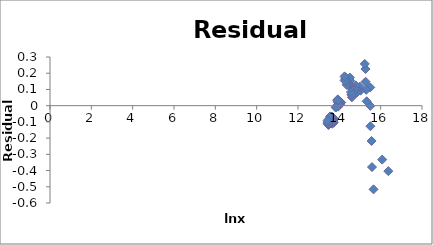
| Category | Series 0 |
|---|---|
| 16.3706277375923 | -0.404 |
| 16.0741044732111 | -0.332 |
| 15.65606114374226 | -0.516 |
| 15.57997950545637 | -0.378 |
| 15.5609019523948 | -0.218 |
| 15.50464133226762 | -0.127 |
| 15.49750817317282 | -0.001 |
| 15.49412559157698 | 0.113 |
| 15.32465465287539 | 0.027 |
| 15.30280569487226 | 0.098 |
| 15.26990716074476 | 0.148 |
| 15.26818494673234 | 0.226 |
| 15.23036103433706 | 0.257 |
| 15.02292134564693 | 0.092 |
| 14.98795492358767 | 0.118 |
| 14.91448011613737 | 0.095 |
| 14.8510800951623 | 0.081 |
| 14.82118887474188 | 0.101 |
| 14.79650867171822 | 0.125 |
| 14.73444818372206 | 0.104 |
| 14.6704329915632 | 0.078 |
| 14.60735399726905 | 0.051 |
| 14.58336485258515 | 0.067 |
| 14.56211888142926 | 0.084 |
| 14.55185658608997 | 0.112 |
| 14.53557908515294 | 0.131 |
| 14.52425792045248 | 0.155 |
| 14.50968071510521 | 0.173 |
| 14.43917153108138 | 0.128 |
| 14.41390630259346 | 0.132 |
| 14.38825126466112 | 0.135 |
| 14.35519124125735 | 0.128 |
| 14.34719648478431 | 0.149 |
| 14.32129871497298 | 0.149 |
| 14.3178615734627 | 0.173 |
| 14.28589598931431 | 0.165 |
| 14.25423828033774 | 0.156 |
| 14.25331893759333 | 0.181 |
| 14.08799878634388 | 0.02 |
| 14.06683876392804 | 0.02 |
| 14.03440188135813 | 0.008 |
| 14.01896229184266 | 0.014 |
| 14.0029373939482 | 0.019 |
| 13.98989402465666 | 0.027 |
| 13.94128733613509 | -0.006 |
| 13.93267918268669 | 0.006 |
| 13.9267012450954 | 0.02 |
| 13.92498539816926 | 0.039 |
| 13.90055458432145 | 0.031 |
| 13.84903237088165 | -0.007 |
| 13.82745691523263 | -0.012 |
| 13.7278578844789 | -0.105 |
| 13.72026867582761 | -0.095 |
| 13.71572779103714 | -0.082 |
| 13.7046125162483 | -0.076 |
| 13.6575916204972 | -0.111 |
| 13.64839401680529 | -0.104 |
| 13.64817179642085 | -0.088 |
| 13.63868387665228 | -0.081 |
| 13.63703439814522 | -0.067 |
| 13.60257720472492 | -0.089 |
| 13.59293934283446 | -0.084 |
| 13.58953800880652 | -0.072 |
| 13.56878103151053 | -0.08 |
| 13.56286352787815 | -0.072 |
| 13.55419384462346 | -0.066 |
| 13.50717533662535 | -0.104 |
| 13.48147734450637 | -0.119 |
| 13.47374393075866 | -0.113 |
| 13.4579151905658 | -0.117 |
| 13.45668616275225 | -0.104 |
| 13.44035300084155 | -0.109 |
| 13.43374781621692 | -0.103 |
| 13.43208821323166 | -0.091 |